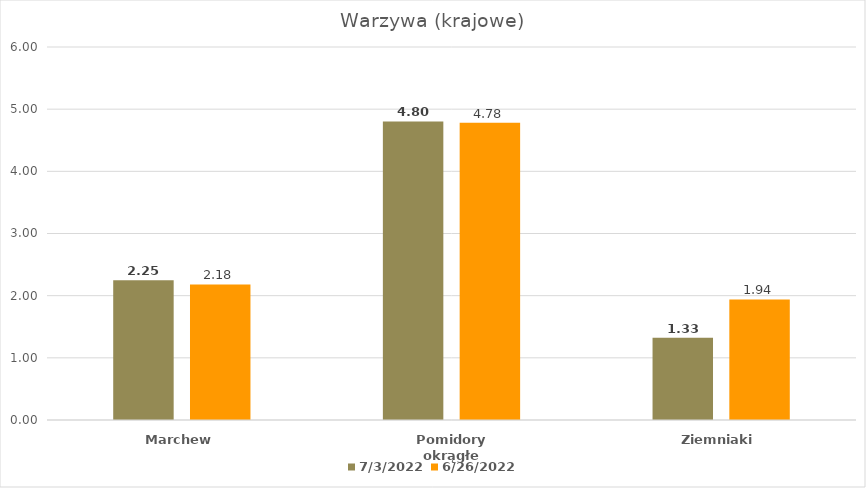
| Category | 03.07.2022 | 26.06.2022 |
|---|---|---|
| Marchew | 2.25 | 2.18 |
| Pomidory okrągłe | 4.803 | 4.78 |
| Ziemniaki | 1.325 | 1.94 |